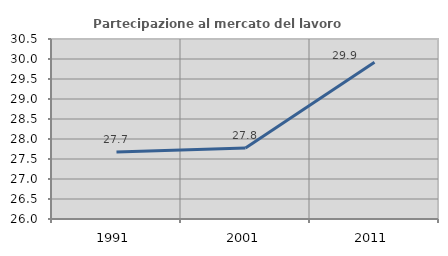
| Category | Partecipazione al mercato del lavoro  femminile |
|---|---|
| 1991.0 | 27.673 |
| 2001.0 | 27.778 |
| 2011.0 | 29.921 |